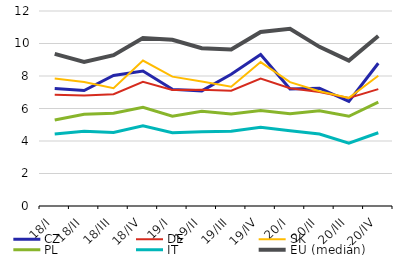
| Category | CZ | DE | SK | PL | IT | EU (medián) |
|---|---|---|---|---|---|---|
| 18/I | 7.237 | 6.853 | 7.844 | 5.295 | 4.425 | 9.361 |
| 18/II | 7.107 | 6.795 | 7.632 | 5.651 | 4.598 | 8.862 |
| 18/III | 8.03 | 6.883 | 7.246 | 5.705 | 4.524 | 9.284 |
| 18/IV | 8.307 | 7.64 | 8.949 | 6.075 | 4.93 | 10.332 |
| 19/I | 7.177 | 7.142 | 7.96 | 5.522 | 4.509 | 10.232 |
| 19/II | 7.085 | 7.154 | 7.664 | 5.834 | 4.572 | 9.714 |
| 19/III | 8.107 | 7.092 | 7.342 | 5.664 | 4.595 | 9.636 |
| 19/IV | 9.318 | 7.836 | 8.856 | 5.877 | 4.839 | 10.709 |
| 20/I | 7.197 | 7.252 | 7.62 | 5.685 | 4.625 | 10.911 |
| 20/II | 7.249 | 7.015 | 7.067 | 5.854 | 4.43 | 9.793 |
| 20/III | 6.434 | 6.644 | 6.655 | 5.521 | 3.861 | 8.944 |
| 20/IV | 8.784 | 7.195 | 8.015 | 6.388 | 4.507 | 10.465 |